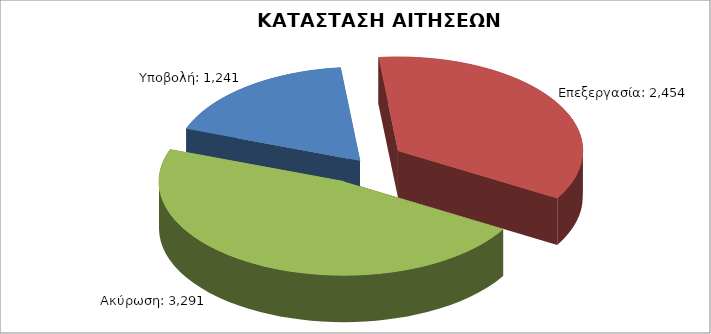
| Category | Series 0 |
|---|---|
| Υποβολή: | 1241 |
| Επεξεργασία: | 2454 |
| Ακύρωση: | 3291 |